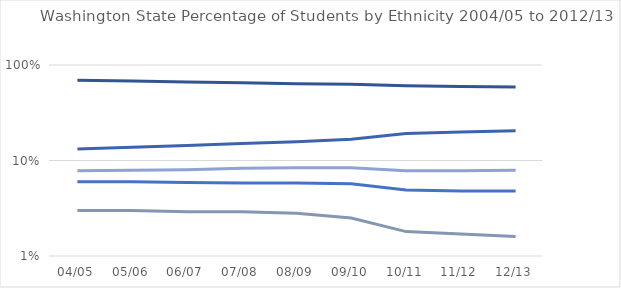
| Category | American Indian | Asian | Black | Hispanic | White |
|---|---|---|---|---|---|
| 04/05 | 0.03 | 0.078 | 0.06 | 0.132 | 0.693 |
| 05/06 | 0.03 | 0.079 | 0.06 | 0.138 | 0.679 |
| 06/07 | 0.029 | 0.08 | 0.059 | 0.144 | 0.665 |
| 07/08 | 0.029 | 0.083 | 0.058 | 0.151 | 0.652 |
| 08/09 | 0.028 | 0.084 | 0.058 | 0.157 | 0.638 |
| 09/10 | 0.025 | 0.084 | 0.057 | 0.167 | 0.628 |
| 10/11 | 0.018 | 0.078 | 0.049 | 0.192 | 0.608 |
| 11/12 | 0.017 | 0.078 | 0.048 | 0.199 | 0.597 |
| 12/13 | 0.016 | 0.079 | 0.048 | 0.205 | 0.589 |